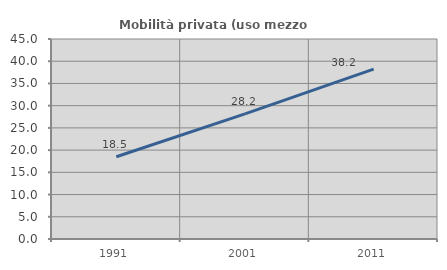
| Category | Mobilità privata (uso mezzo privato) |
|---|---|
| 1991.0 | 18.511 |
| 2001.0 | 28.155 |
| 2011.0 | 38.235 |